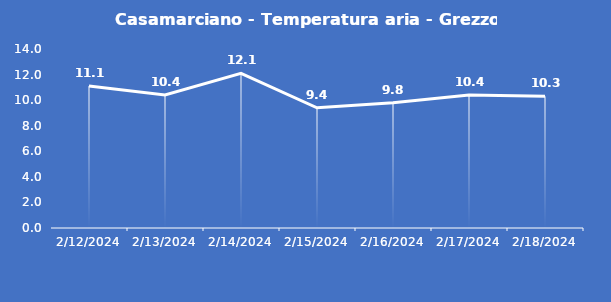
| Category | Casamarciano - Temperatura aria - Grezzo (°C) |
|---|---|
| 2/12/24 | 11.1 |
| 2/13/24 | 10.4 |
| 2/14/24 | 12.1 |
| 2/15/24 | 9.4 |
| 2/16/24 | 9.8 |
| 2/17/24 | 10.4 |
| 2/18/24 | 10.3 |